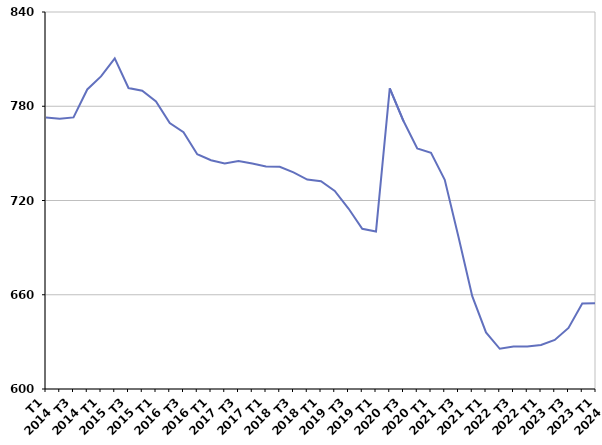
| Category | Moins de 25 ans |
|---|---|
| T1
2014 | 772.8 |
| T2
2014 | 772 |
| T3
2014 | 772.9 |
| T4
2014 | 790.7 |
| T1
2015 | 799 |
| T2
2015 | 810.5 |
| T3
2015 | 791.6 |
| T4
2015 | 789.9 |
| T1
2016 | 783.1 |
| T2
2016 | 769.3 |
| T3
2016 | 763.5 |
| T4
2016 | 749.5 |
| T1
2017 | 745.6 |
| T2
2017 | 743.5 |
| T3
2017 | 745.2 |
| T4
2017 | 743.5 |
| T1
2018 | 741.6 |
| T2
2018 | 741.5 |
| T3
2018 | 737.9 |
| T4
2018 | 733.3 |
| T1
2019 | 732.3 |
| T2
2019 | 726.1 |
| T3
2019 | 714.9 |
| T4
2019 | 702 |
| T1
2020 | 700.3 |
| T2
2020 | 791.4 |
| T3
2020 | 770.6 |
| T4
2020 | 753.2 |
| T1
2021 | 750.3 |
| T2
2021 | 733.2 |
| T3
2021 | 696.7 |
| T4
2021 | 659.1 |
| T1
2022 | 636 |
| T2
2022 | 625.6 |
| T3
2022 | 627.1 |
| T4
2022 | 627.1 |
| T1
2023 | 628 |
| T2
2023 | 631.2 |
| T3
2023 | 638.9 |
| T4
2023 | 654.4 |
| T1
2024 | 654.6 |